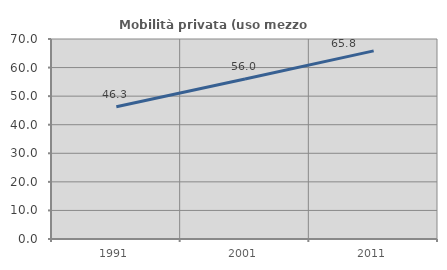
| Category | Mobilità privata (uso mezzo privato) |
|---|---|
| 1991.0 | 46.291 |
| 2001.0 | 55.987 |
| 2011.0 | 65.836 |